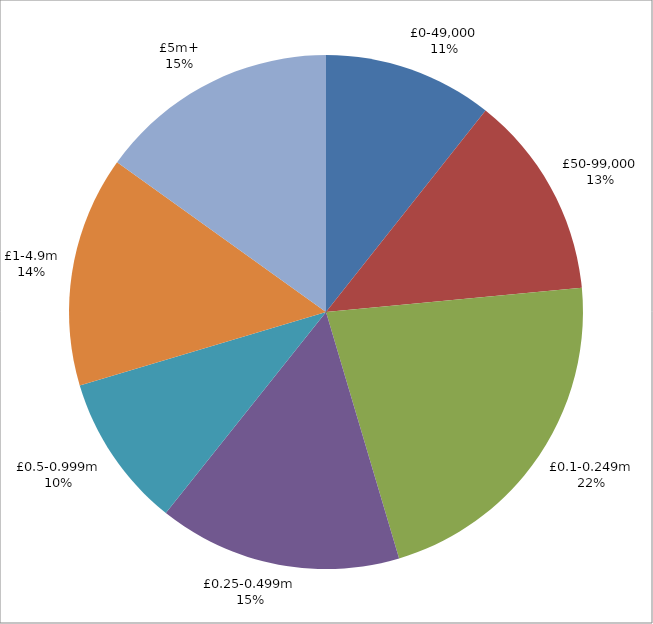
| Category | Series 0 |
|---|---|
| £0-49,000 | 108 |
| £50-99,000 | 130 |
| £0.1-0.249m | 222 |
| £0.25-0.499m | 155 |
| £0.5-0.999m | 98 |
| £1-4.9m | 147 |
| £5m+ | 153 |